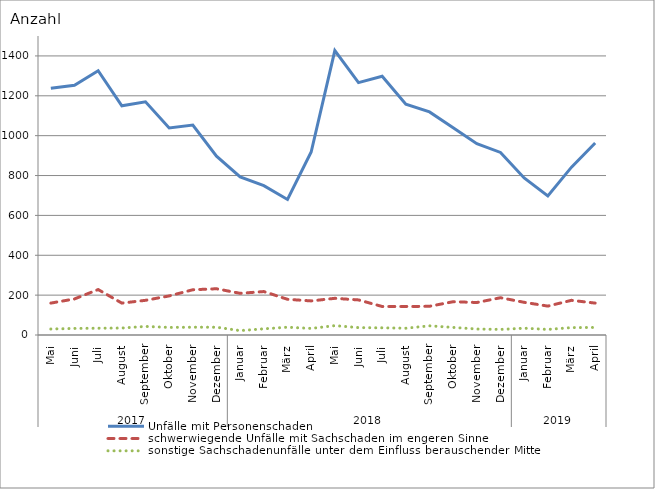
| Category | Unfälle mit Personenschaden | schwerwiegende Unfälle mit Sachschaden im engeren Sinne | sonstige Sachschadenunfälle unter dem Einfluss berauschender Mittel |
|---|---|---|---|
| 0 | 1238 | 160 | 30 |
| 1 | 1253 | 181 | 33 |
| 2 | 1326 | 228 | 34 |
| 3 | 1150 | 160 | 35 |
| 4 | 1170 | 174 | 43 |
| 5 | 1039 | 196 | 38 |
| 6 | 1053 | 227 | 39 |
| 7 | 897 | 232 | 39 |
| 8 | 793 | 209 | 22 |
| 9 | 749 | 218 | 31 |
| 10 | 680 | 179 | 39 |
| 11 | 918 | 171 | 33 |
| 12 | 1427 | 184 | 47 |
| 13 | 1266 | 176 | 37 |
| 14 | 1298 | 143 | 36 |
| 15 | 1158 | 143 | 34 |
| 16 | 1119 | 144 | 46 |
| 17 | 1040 | 167 | 38 |
| 18 | 960 | 163 | 30 |
| 19 | 916 | 187 | 28 |
| 20 | 788 | 164 | 34 |
| 21 | 698 | 145 | 28 |
| 22 | 842 | 174 | 37 |
| 23 | 963 | 160 | 38 |